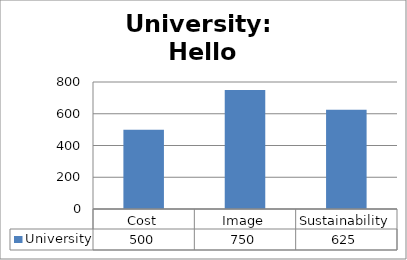
| Category | University |
|---|---|
| Cost | 500 |
| Image | 750 |
| Sustainability | 625 |